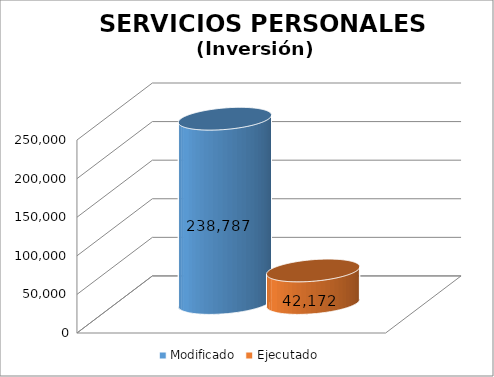
| Category | Modificado | Ejecutado |
|---|---|---|
| 0 | 238787 | 42171.6 |